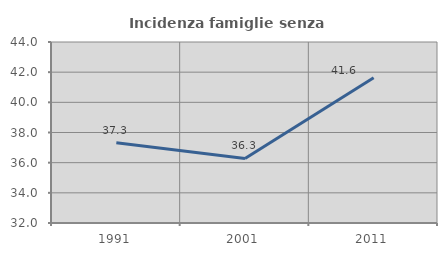
| Category | Incidenza famiglie senza nuclei |
|---|---|
| 1991.0 | 37.313 |
| 2001.0 | 36.279 |
| 2011.0 | 41.624 |